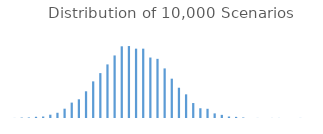
| Category | Series 0 |
|---|---|
| 0 | 1 |
| 1 | 5 |
| 2 | 6 |
| 3 | 14 |
| 4 | 17 |
| 5 | 38 |
| 6 | 60 |
| 7 | 107 |
| 8 | 177 |
| 9 | 215 |
| 10 | 307 |
| 11 | 421 |
| 12 | 516 |
| 13 | 616 |
| 14 | 719 |
| 15 | 824 |
| 16 | 827 |
| 17 | 797 |
| 18 | 797 |
| 19 | 695 |
| 20 | 680 |
| 21 | 570 |
| 22 | 452 |
| 23 | 348 |
| 24 | 272 |
| 25 | 172 |
| 26 | 112 |
| 27 | 106 |
| 28 | 53 |
| 29 | 36 |
| 30 | 17 |
| 31 | 13 |
| 32 | 6 |
| 33 | 0 |
| 34 | 1 |
| 35 | 0 |
| 36 | 1 |
| 37 | 1 |
| 38 | 0 |
| 39 | 0 |
| 40 | 1 |